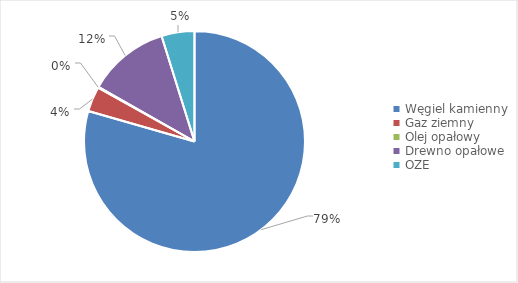
| Category | Series 0 |
|---|---|
| Węgiel kamienny | 44221.605 |
| Gaz ziemny | 2037.044 |
| Olej opałowy | 71.481 |
| Drewno opałowe | 6654.074 |
| OZE | 2683.333 |